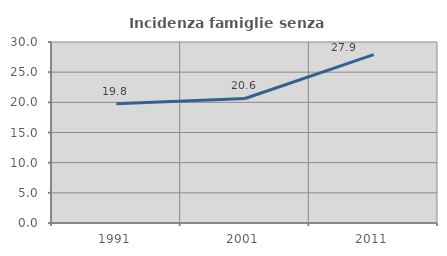
| Category | Incidenza famiglie senza nuclei |
|---|---|
| 1991.0 | 19.783 |
| 2001.0 | 20.636 |
| 2011.0 | 27.901 |